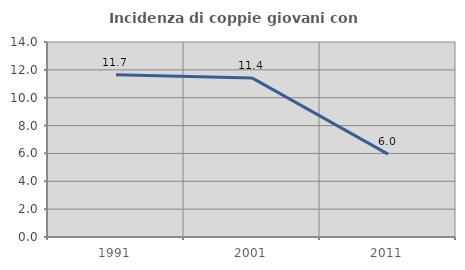
| Category | Incidenza di coppie giovani con figli |
|---|---|
| 1991.0 | 11.653 |
| 2001.0 | 11.421 |
| 2011.0 | 5.952 |